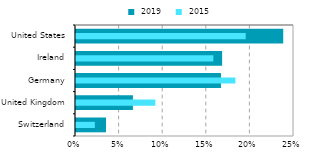
| Category |  2019 |
|---|---|
| Switzerland | 0.034 |
| United Kingdom | 0.065 |
| Germany | 0.166 |
| Ireland | 0.168 |
| United States | 0.238 |